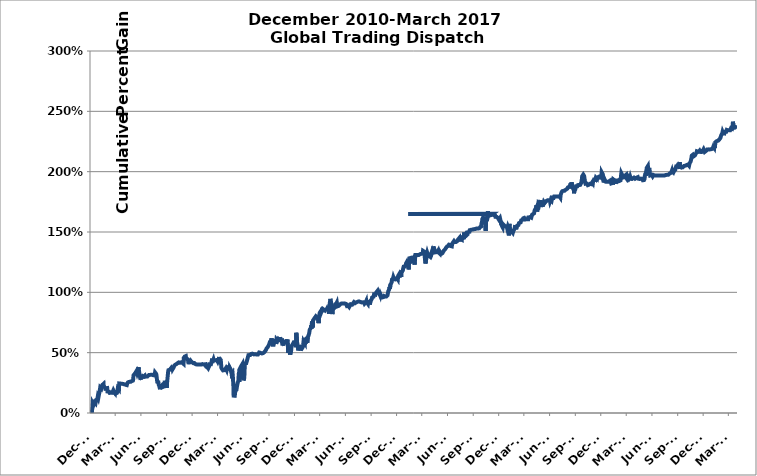
| Category | December 2010-December 2016 Global Trading Dispatch Performance |
|---|---|
| 2010-12-01 | 0 |
| 2010-12-02 | 0 |
| 2010-12-03 | 0 |
| 2010-12-07 | 0 |
| 2010-12-08 | 0 |
| 2010-12-09 | 0.048 |
| 2010-12-10 | 0.081 |
| 2010-12-13 | 0.067 |
| 2010-12-14 | 0.068 |
| 2010-12-15 | 0.075 |
| 2010-12-16 | 0.087 |
| 2010-12-17 | 0.087 |
| 2010-12-20 | 0.078 |
| 2010-12-22 | 0.107 |
| 2010-12-23 | 0.102 |
| 2010-12-24 | 0.102 |
| 2010-12-27 | 0.118 |
| 2010-12-28 | 0.132 |
| 2010-12-29 | 0.127 |
| 2010-12-30 | 0.122 |
| 2010-12-31 | 0.123 |
| 2011-01-03 | 0.17 |
| 2011-01-04 | 0.169 |
| 2011-01-05 | 0.195 |
| 2011-01-06 | 0.211 |
| 2011-01-07 | 0.211 |
| 2011-01-10 | 0.202 |
| 2011-01-11 | 0.211 |
| 2011-01-12 | 0.224 |
| 2011-01-13 | 0.22 |
| 2011-01-14 | 0.233 |
| 2011-01-18 | 0.242 |
| 2011-01-19 | 0.208 |
| 2011-01-20 | 0.217 |
| 2011-01-21 | 0.214 |
| 2011-01-24 | 0.208 |
| 2011-01-25 | 0.2 |
| 2011-01-26 | 0.187 |
| 2011-01-27 | 0.204 |
| 2011-01-28 | 0.21 |
| 2011-01-31 | 0.206 |
| 2011-02-01 | 0.178 |
| 2011-02-02 | 0.18 |
| 2011-02-03 | 0.184 |
| 2011-02-04 | 0.184 |
| 2011-02-07 | 0.176 |
| 2011-02-08 | 0.17 |
| 2011-02-09 | 0.167 |
| 2011-02-10 | 0.174 |
| 2011-02-11 | 0.172 |
| 2011-02-14 | 0.168 |
| 2011-02-15 | 0.17 |
| 2011-02-16 | 0.167 |
| 2011-02-17 | 0.164 |
| 2011-02-18 | 0.167 |
| 2011-02-22 | 0.189 |
| 2011-02-23 | 0.189 |
| 2011-02-24 | 0.179 |
| 2011-02-25 | 0.176 |
| 2011-02-28 | 0.166 |
| 2011-03-01 | 0.188 |
| 2011-03-02 | 0.181 |
| 2011-03-03 | 0.163 |
| 2011-03-04 | 0.167 |
| 2011-03-07 | 0.167 |
| 2011-03-08 | 0.175 |
| 2011-03-09 | 0.169 |
| 2011-03-10 | 0.205 |
| 2011-03-11 | 0.206 |
| 2011-03-14 | 0.194 |
| 2011-03-15 | 0.245 |
| 2011-03-16 | 0.25 |
| 2011-03-17 | 0.238 |
| 2011-03-18 | 0.238 |
| 2011-03-22 | 0.243 |
| 2011-03-23 | 0.245 |
| 2011-03-25 | 0.242 |
| 2011-03-28 | 0.241 |
| 2011-04-11 | 0.231 |
| 2011-04-12 | 0.241 |
| 2011-04-13 | 0.246 |
| 2011-04-14 | 0.246 |
| 2011-04-15 | 0.254 |
| 2011-04-18 | 0.254 |
| 2011-04-19 | 0.258 |
| 2011-04-20 | 0.256 |
| 2011-04-21 | 0.257 |
| 2011-04-25 | 0.259 |
| 2011-04-26 | 0.261 |
| 2011-04-29 | 0.265 |
| 2011-05-02 | 0.263 |
| 2011-05-03 | 0.268 |
| 2011-05-04 | 0.28 |
| 2011-05-05 | 0.312 |
| 2011-05-10 | 0.326 |
| 2011-05-11 | 0.334 |
| 2011-05-12 | 0.329 |
| 2011-05-13 | 0.337 |
| 2011-05-16 | 0.349 |
| 2011-05-17 | 0.344 |
| 2011-05-18 | 0.332 |
| 2011-05-19 | 0.33 |
| 2011-05-20 | 0.346 |
| 2011-05-23 | 0.38 |
| 2011-05-24 | 0.359 |
| 2011-05-25 | 0.344 |
| 2011-05-26 | 0.329 |
| 2011-05-27 | 0.308 |
| 2011-05-31 | 0.277 |
| 2011-06-01 | 0.312 |
| 2011-06-02 | 0.299 |
| 2011-06-03 | 0.304 |
| 2011-06-06 | 0.307 |
| 2011-06-07 | 0.3 |
| 2011-06-08 | 0.302 |
| 2011-06-09 | 0.304 |
| 2011-06-10 | 0.301 |
| 2011-06-13 | 0.303 |
| 2011-06-14 | 0.309 |
| 2011-06-15 | 0.3 |
| 2011-06-16 | 0.3 |
| 2011-06-17 | 0.301 |
| 2011-06-20 | 0.303 |
| 2011-06-21 | 0.305 |
| 2011-06-22 | 0.306 |
| 2011-06-23 | 0.302 |
| 2011-06-24 | 0.303 |
| 2011-06-27 | 0.31 |
| 2011-06-29 | 0.315 |
| 2011-06-30 | 0.316 |
| 2011-07-01 | 0.316 |
| 2011-07-05 | 0.316 |
| 2011-07-06 | 0.316 |
| 2011-07-08 | 0.317 |
| 2011-07-11 | 0.316 |
| 2011-07-12 | 0.313 |
| 2011-07-13 | 0.31 |
| 2011-07-14 | 0.313 |
| 2011-07-15 | 0.313 |
| 2011-07-18 | 0.313 |
| 2011-07-19 | 0.311 |
| 2011-07-20 | 0.311 |
| 2011-07-21 | 0.336 |
| 2011-07-22 | 0.33 |
| 2011-07-25 | 0.324 |
| 2011-07-26 | 0.315 |
| 2011-07-27 | 0.295 |
| 2011-07-28 | 0.275 |
| 2011-07-29 | 0.258 |
| 2011-08-01 | 0.257 |
| 2011-08-02 | 0.256 |
| 2011-08-03 | 0.236 |
| 2011-08-04 | 0.227 |
| 2011-08-05 | 0.224 |
| 2011-08-08 | 0.197 |
| 2011-08-09 | 0.195 |
| 2011-08-10 | 0.191 |
| 2011-08-11 | 0.222 |
| 2011-08-12 | 0.229 |
| 2011-08-15 | 0.232 |
| 2011-08-16 | 0.229 |
| 2011-08-17 | 0.229 |
| 2011-08-18 | 0.225 |
| 2011-08-19 | 0.217 |
| 2011-08-22 | 0.218 |
| 2011-08-23 | 0.221 |
| 2011-08-24 | 0.248 |
| 2011-08-25 | 0.267 |
| 2011-08-26 | 0.256 |
| 2011-08-29 | 0.262 |
| 2011-08-30 | 0.254 |
| 2011-08-31 | 0.226 |
| 2011-09-01 | 0.208 |
| 2011-09-02 | 0.251 |
| 2011-09-06 | 0.345 |
| 2011-09-07 | 0.355 |
| 2011-09-09 | 0.36 |
| 2011-09-12 | 0.359 |
| 2011-09-13 | 0.363 |
| 2011-09-14 | 0.364 |
| 2011-09-15 | 0.367 |
| 2011-09-16 | 0.371 |
| 2011-09-19 | 0.353 |
| 2011-09-20 | 0.388 |
| 2011-09-21 | 0.377 |
| 2011-09-22 | 0.364 |
| 2011-09-26 | 0.38 |
| 2011-09-27 | 0.39 |
| 2011-09-29 | 0.384 |
| 2011-09-30 | 0.398 |
| 2011-10-03 | 0.394 |
| 2011-10-05 | 0.405 |
| 2011-10-06 | 0.407 |
| 2011-10-10 | 0.413 |
| 2011-10-11 | 0.414 |
| 2011-10-12 | 0.418 |
| 2011-10-13 | 0.416 |
| 2011-10-14 | 0.42 |
| 2011-10-17 | 0.414 |
| 2011-10-18 | 0.416 |
| 2011-10-19 | 0.416 |
| 2011-10-21 | 0.422 |
| 2011-10-24 | 0.421 |
| 2011-10-25 | 0.413 |
| 2011-10-26 | 0.418 |
| 2011-10-31 | 0.407 |
| 2011-11-01 | 0.458 |
| 2011-11-02 | 0.46 |
| 2011-11-03 | 0.464 |
| 2011-11-04 | 0.468 |
| 2011-11-08 | 0.472 |
| 2011-11-09 | 0.452 |
| 2011-11-10 | 0.453 |
| 2011-11-11 | 0.457 |
| 2011-11-14 | 0.446 |
| 2011-11-15 | 0.447 |
| 2011-11-16 | 0.435 |
| 2011-11-17 | 0.419 |
| 2011-11-18 | 0.426 |
| 2011-11-21 | 0.419 |
| 2011-11-22 | 0.419 |
| 2011-11-23 | 0.426 |
| 2011-11-25 | 0.434 |
| 2011-11-28 | 0.426 |
| 2011-11-29 | 0.422 |
| 2011-11-30 | 0.423 |
| 2011-12-01 | 0.419 |
| 2011-12-05 | 0.413 |
| 2011-12-06 | 0.417 |
| 2011-12-07 | 0.414 |
| 2011-12-08 | 0.408 |
| 2011-12-09 | 0.414 |
| 2011-12-12 | 0.407 |
| 2011-12-13 | 0.404 |
| 2011-12-14 | 0.402 |
| 2011-12-15 | 0.402 |
| 2011-12-16 | 0.402 |
| 2011-12-19 | 0.402 |
| 2011-12-20 | 0.402 |
| 2011-12-21 | 0.402 |
| 2011-12-22 | 0.402 |
| 2011-12-23 | 0.402 |
| 2011-12-26 | 0.402 |
| 2011-12-27 | 0.402 |
| 2011-12-28 | 0.402 |
| 2011-12-29 | 0.402 |
| 2011-12-30 | 0.402 |
| 2012-01-02 | 0.402 |
| 2012-01-03 | 0.402 |
| 2012-01-04 | 0.402 |
| 2012-01-05 | 0.403 |
| 2012-01-06 | 0.405 |
| 2012-01-09 | 0.403 |
| 2012-01-10 | 0.402 |
| 2012-01-11 | 0.406 |
| 2012-01-12 | 0.4 |
| 2012-01-13 | 0.408 |
| 2012-01-17 | 0.404 |
| 2012-01-18 | 0.392 |
| 2012-01-19 | 0.384 |
| 2012-01-20 | 0.384 |
| 2012-01-23 | 0.379 |
| 2012-01-24 | 0.379 |
| 2012-01-25 | 0.372 |
| 2012-01-26 | 0.374 |
| 2012-01-27 | 0.37 |
| 2012-01-30 | 0.386 |
| 2012-01-31 | 0.405 |
| 2012-02-01 | 0.408 |
| 2012-02-02 | 0.402 |
| 2012-02-03 | 0.404 |
| 2012-02-06 | 0.405 |
| 2012-02-07 | 0.406 |
| 2012-02-08 | 0.41 |
| 2012-02-09 | 0.435 |
| 2012-02-10 | 0.432 |
| 2012-02-13 | 0.431 |
| 2012-02-14 | 0.432 |
| 2012-02-15 | 0.444 |
| 2012-02-16 | 0.435 |
| 2012-02-17 | 0.429 |
| 2012-02-21 | 0.436 |
| 2012-02-22 | 0.441 |
| 2012-02-23 | 0.438 |
| 2012-02-24 | 0.443 |
| 2012-02-27 | 0.44 |
| 2012-02-28 | 0.434 |
| 2012-02-29 | 0.432 |
| 2012-03-01 | 0.426 |
| 2012-03-02 | 0.427 |
| 2012-03-05 | 0.451 |
| 2012-03-06 | 0.464 |
| 2012-03-07 | 0.451 |
| 2012-03-08 | 0.453 |
| 2012-03-09 | 0.452 |
| 2012-03-12 | 0.439 |
| 2012-03-13 | 0.411 |
| 2012-03-14 | 0.375 |
| 2012-03-15 | 0.367 |
| 2012-03-16 | 0.366 |
| 2012-03-19 | 0.359 |
| 2012-03-20 | 0.353 |
| 2012-03-21 | 0.356 |
| 2012-03-22 | 0.359 |
| 2012-03-23 | 0.355 |
| 2012-03-26 | 0.356 |
| 2012-03-27 | 0.348 |
| 2012-03-28 | 0.35 |
| 2012-03-29 | 0.355 |
| 2012-03-30 | 0.37 |
| 2012-04-02 | 0.356 |
| 2012-04-03 | 0.368 |
| 2012-04-04 | 0.379 |
| 2012-04-05 | 0.375 |
| 2012-04-09 | 0.373 |
| 2012-04-10 | 0.391 |
| 2012-04-11 | 0.387 |
| 2012-04-12 | 0.353 |
| 2012-04-13 | 0.376 |
| 2012-04-16 | 0.363 |
| 2012-04-18 | 0.342 |
| 2012-04-19 | 0.352 |
| 2012-04-20 | 0.325 |
| 2012-04-23 | 0.335 |
| 2012-04-24 | 0.308 |
| 2012-04-25 | 0.269 |
| 2012-04-26 | 0.23 |
| 2012-04-27 | 0.144 |
| 2012-04-30 | 0.137 |
| 2012-05-01 | 0.143 |
| 2012-05-02 | 0.16 |
| 2012-05-03 | 0.183 |
| 2012-05-04 | 0.177 |
| 2012-05-07 | 0.192 |
| 2012-05-08 | 0.206 |
| 2012-05-09 | 0.222 |
| 2012-05-10 | 0.235 |
| 2012-05-11 | 0.244 |
| 2012-05-14 | 0.27 |
| 2012-05-15 | 0.31 |
| 2012-05-16 | 0.339 |
| 2012-05-17 | 0.26 |
| 2012-05-18 | 0.362 |
| 2012-05-21 | 0.367 |
| 2012-05-22 | 0.38 |
| 2012-05-23 | 0.374 |
| 2012-05-24 | 0.382 |
| 2012-05-25 | 0.381 |
| 2012-05-29 | 0.408 |
| 2012-05-30 | 0.386 |
| 2012-05-31 | 0.342 |
| 2012-06-01 | 0.27 |
| 2012-06-04 | 0.289 |
| 2012-06-05 | 0.344 |
| 2012-06-06 | 0.411 |
| 2012-06-07 | 0.415 |
| 2012-06-08 | 0.417 |
| 2012-06-11 | 0.413 |
| 2012-06-12 | 0.42 |
| 2012-06-13 | 0.429 |
| 2012-06-14 | 0.432 |
| 2012-06-15 | 0.445 |
| 2012-06-18 | 0.451 |
| 2012-06-19 | 0.48 |
| 2012-06-20 | 0.48 |
| 2012-06-21 | 0.48 |
| 2012-06-22 | 0.487 |
| 2012-06-25 | 0.48 |
| 2012-06-26 | 0.482 |
| 2012-06-27 | 0.484 |
| 2012-06-28 | 0.483 |
| 2012-06-29 | 0.489 |
| 2012-07-02 | 0.489 |
| 2012-07-03 | 0.492 |
| 2012-07-05 | 0.492 |
| 2012-07-06 | 0.489 |
| 2012-07-09 | 0.486 |
| 2012-07-10 | 0.484 |
| 2012-07-11 | 0.486 |
| 2012-07-12 | 0.481 |
| 2012-07-13 | 0.487 |
| 2012-07-16 | 0.485 |
| 2012-07-17 | 0.485 |
| 2012-07-18 | 0.485 |
| 2012-07-19 | 0.485 |
| 2012-07-20 | 0.485 |
| 2012-07-23 | 0.485 |
| 2012-07-24 | 0.485 |
| 2012-07-25 | 0.485 |
| 2012-07-26 | 0.489 |
| 2012-07-27 | 0.501 |
| 2012-07-30 | 0.494 |
| 2012-07-31 | 0.499 |
| 2012-08-02 | 0.506 |
| 2012-08-03 | 0.496 |
| 2012-08-06 | 0.493 |
| 2012-08-07 | 0.495 |
| 2012-08-08 | 0.495 |
| 2012-08-09 | 0.494 |
| 2012-08-10 | 0.496 |
| 2012-08-13 | 0.501 |
| 2012-08-14 | 0.503 |
| 2012-08-15 | 0.502 |
| 2012-08-16 | 0.501 |
| 2012-08-17 | 0.509 |
| 2012-08-20 | 0.52 |
| 2012-08-21 | 0.519 |
| 2012-08-22 | 0.518 |
| 2012-08-23 | 0.536 |
| 2012-08-24 | 0.541 |
| 2012-08-27 | 0.547 |
| 2012-08-28 | 0.545 |
| 2012-08-29 | 0.546 |
| 2012-08-30 | 0.542 |
| 2012-08-31 | 0.564 |
| 2012-09-04 | 0.59 |
| 2012-09-05 | 0.6 |
| 2012-09-06 | 0.6 |
| 2012-09-07 | 0.584 |
| 2012-09-10 | 0.618 |
| 2012-09-11 | 0.586 |
| 2012-09-12 | 0.582 |
| 2012-09-13 | 0.566 |
| 2012-09-16 | 0.565 |
| 2012-09-17 | 0.566 |
| 2012-09-18 | 0.566 |
| 2012-09-19 | 0.596 |
| 2012-09-20 | 0.593 |
| 2012-09-21 | 0.599 |
| 2012-09-24 | 0.599 |
| 2012-09-25 | 0.572 |
| 2012-09-26 | 0.566 |
| 2012-09-27 | 0.61 |
| 2012-10-01 | 0.599 |
| 2012-10-02 | 0.602 |
| 2012-10-03 | 0.605 |
| 2012-10-04 | 0.614 |
| 2012-10-05 | 0.614 |
| 2012-10-08 | 0.607 |
| 2012-10-09 | 0.601 |
| 2012-10-10 | 0.629 |
| 2012-10-11 | 0.614 |
| 2012-10-12 | 0.614 |
| 2012-10-15 | 0.599 |
| 2012-10-16 | 0.616 |
| 2012-10-17 | 0.603 |
| 2012-10-18 | 0.577 |
| 2012-10-19 | 0.559 |
| 2012-10-22 | 0.581 |
| 2012-10-23 | 0.586 |
| 2012-10-24 | 0.582 |
| 2012-10-25 | 0.591 |
| 2012-10-26 | 0.584 |
| 2012-10-30 | 0.584 |
| 2012-10-31 | 0.584 |
| 2012-11-01 | 0.605 |
| 2012-11-02 | 0.587 |
| 2012-11-05 | 0.609 |
| 2012-11-06 | 0.613 |
| 2012-11-07 | 0.551 |
| 2012-11-08 | 0.499 |
| 2012-11-09 | 0.521 |
| 2012-11-12 | 0.525 |
| 2012-11-13 | 0.514 |
| 2012-11-14 | 0.494 |
| 2012-11-15 | 0.484 |
| 2012-11-16 | 0.491 |
| 2012-11-19 | 0.524 |
| 2012-11-20 | 0.555 |
| 2012-11-21 | 0.554 |
| 2012-11-23 | 0.56 |
| 2012-11-26 | 0.576 |
| 2012-11-27 | 0.578 |
| 2012-11-28 | 0.587 |
| 2012-11-29 | 0.588 |
| 2012-11-30 | 0.582 |
| 2012-12-03 | 0.587 |
| 2012-12-04 | 0.586 |
| 2012-12-05 | 0.59 |
| 2012-12-06 | 0.546 |
| 2012-12-07 | 0.664 |
| 2012-12-10 | 0.583 |
| 2012-12-11 | 0.59 |
| 2012-12-12 | 0.578 |
| 2012-12-13 | 0.552 |
| 2012-12-14 | 0.518 |
| 2012-12-17 | 0.563 |
| 2012-12-18 | 0.558 |
| 2012-12-19 | 0.544 |
| 2012-12-20 | 0.537 |
| 2012-12-21 | 0.532 |
| 2012-12-24 | 0.534 |
| 2012-12-26 | 0.53 |
| 2012-12-27 | 0.532 |
| 2012-12-28 | 0.524 |
| 2012-12-31 | 0.55 |
| 2013-01-02 | 0.596 |
| 2013-01-03 | 0.591 |
| 2013-01-04 | 0.597 |
| 2013-01-07 | 0.578 |
| 2013-01-08 | 0.621 |
| 2013-01-09 | 0.574 |
| 2013-01-10 | 0.614 |
| 2013-01-11 | 0.619 |
| 2013-01-14 | 0.621 |
| 2013-01-15 | 0.582 |
| 2013-01-16 | 0.575 |
| 2013-01-17 | 0.623 |
| 2013-01-18 | 0.619 |
| 2013-01-22 | 0.66 |
| 2013-01-23 | 0.665 |
| 2013-01-24 | 0.69 |
| 2013-01-25 | 0.695 |
| 2013-01-28 | 0.705 |
| 2013-01-29 | 0.727 |
| 2013-01-30 | 0.699 |
| 2013-01-31 | 0.718 |
| 2013-02-01 | 0.76 |
| 2013-02-04 | 0.709 |
| 2013-02-05 | 0.768 |
| 2013-02-06 | 0.77 |
| 2013-02-07 | 0.773 |
| 2013-02-08 | 0.775 |
| 2013-02-11 | 0.788 |
| 2013-02-12 | 0.786 |
| 2013-02-13 | 0.796 |
| 2013-02-14 | 0.789 |
| 2013-02-15 | 0.802 |
| 2013-02-19 | 0.793 |
| 2013-02-20 | 0.804 |
| 2013-02-21 | 0.788 |
| 2013-02-22 | 0.801 |
| 2013-02-25 | 0.745 |
| 2013-02-26 | 0.792 |
| 2013-02-27 | 0.811 |
| 2013-02-28 | 0.819 |
| 2013-03-01 | 0.831 |
| 2013-03-04 | 0.842 |
| 2013-03-05 | 0.829 |
| 2013-03-06 | 0.836 |
| 2013-03-07 | 0.841 |
| 2013-03-08 | 0.854 |
| 2013-03-11 | 0.857 |
| 2013-03-12 | 0.852 |
| 2013-03-13 | 0.861 |
| 2013-03-14 | 0.868 |
| 2013-03-15 | 0.853 |
| 2013-03-18 | 0.852 |
| 2013-03-19 | 0.856 |
| 2013-03-20 | 0.869 |
| 2013-03-21 | 0.857 |
| 2013-03-22 | 0.852 |
| 2013-03-25 | 0.857 |
| 2013-03-26 | 0.862 |
| 2013-03-27 | 0.866 |
| 2013-03-28 | 0.862 |
| 2013-04-01 | 0.844 |
| 2013-04-02 | 0.839 |
| 2013-04-03 | 0.823 |
| 2013-04-04 | 0.86 |
| 2013-04-05 | 0.9 |
| 2013-04-08 | 0.946 |
| 2013-04-09 | 0.937 |
| 2013-04-10 | 0.92 |
| 2013-04-11 | 0.925 |
| 2013-04-12 | 0.889 |
| 2013-04-15 | 0.82 |
| 2013-04-16 | 0.884 |
| 2013-04-17 | 0.859 |
| 2013-04-18 | 0.856 |
| 2013-04-19 | 0.857 |
| 2013-04-22 | 0.87 |
| 2013-04-23 | 0.885 |
| 2013-04-24 | 0.888 |
| 2013-04-25 | 0.901 |
| 2013-04-26 | 0.904 |
| 2013-04-29 | 0.906 |
| 2013-04-30 | 0.911 |
| 2013-05-01 | 0.915 |
| 2013-05-02 | 0.909 |
| 2013-05-03 | 0.884 |
| 2013-05-06 | 0.886 |
| 2013-05-07 | 0.887 |
| 2013-05-08 | 0.884 |
| 2013-05-09 | 0.888 |
| 2013-05-10 | 0.894 |
| 2013-05-13 | 0.901 |
| 2013-05-14 | 0.902 |
| 2013-05-15 | 0.903 |
| 2013-05-16 | 0.903 |
| 2013-05-17 | 0.907 |
| 2013-05-20 | 0.908 |
| 2013-05-21 | 0.908 |
| 2013-05-22 | 0.907 |
| 2013-05-23 | 0.904 |
| 2013-05-24 | 0.904 |
| 2013-05-28 | 0.908 |
| 2013-05-29 | 0.909 |
| 2013-05-30 | 0.91 |
| 2013-05-31 | 0.908 |
| 2013-06-03 | 0.904 |
| 2013-06-04 | 0.909 |
| 2013-06-05 | 0.904 |
| 2013-06-06 | 0.887 |
| 2013-06-07 | 0.886 |
| 2013-06-10 | 0.889 |
| 2013-06-11 | 0.887 |
| 2013-06-12 | 0.891 |
| 2013-06-13 | 0.886 |
| 2013-06-14 | 0.878 |
| 2013-06-17 | 0.891 |
| 2013-06-18 | 0.9 |
| 2013-06-19 | 0.911 |
| 2013-06-20 | 0.888 |
| 2013-06-21 | 0.901 |
| 2013-06-24 | 0.895 |
| 2013-06-25 | 0.899 |
| 2013-06-26 | 0.903 |
| 2013-06-27 | 0.903 |
| 2013-06-28 | 0.904 |
| 2013-07-01 | 0.919 |
| 2013-07-02 | 0.913 |
| 2013-07-03 | 0.913 |
| 2013-07-05 | 0.91 |
| 2013-07-08 | 0.915 |
| 2013-07-09 | 0.916 |
| 2013-07-10 | 0.917 |
| 2013-07-11 | 0.921 |
| 2013-07-12 | 0.921 |
| 2013-07-15 | 0.923 |
| 2013-07-16 | 0.922 |
| 2013-07-17 | 0.92 |
| 2013-07-18 | 0.925 |
| 2013-07-19 | 0.925 |
| 2013-07-22 | 0.922 |
| 2013-07-23 | 0.921 |
| 2013-07-24 | 0.921 |
| 2013-07-25 | 0.914 |
| 2013-07-26 | 0.916 |
| 2013-07-29 | 0.916 |
| 2013-07-30 | 0.912 |
| 2013-07-31 | 0.914 |
| 2013-08-01 | 0.922 |
| 2013-08-02 | 0.917 |
| 2013-08-05 | 0.92 |
| 2013-08-06 | 0.918 |
| 2013-08-07 | 0.912 |
| 2013-08-08 | 0.907 |
| 2013-08-09 | 0.912 |
| 2013-08-12 | 0.917 |
| 2013-08-13 | 0.922 |
| 2013-08-14 | 0.928 |
| 2013-08-15 | 0.908 |
| 2013-08-16 | 0.917 |
| 2013-08-19 | 0.92 |
| 2013-08-20 | 0.904 |
| 2013-08-21 | 0.922 |
| 2013-08-22 | 0.927 |
| 2013-08-23 | 0.92 |
| 2013-08-26 | 0.922 |
| 2013-08-27 | 0.899 |
| 2013-08-28 | 0.906 |
| 2013-08-29 | 0.926 |
| 2013-08-30 | 0.932 |
| 2013-09-03 | 0.946 |
| 2013-09-04 | 0.957 |
| 2013-09-05 | 0.956 |
| 2013-09-06 | 0.95 |
| 2013-09-09 | 0.963 |
| 2013-09-10 | 0.971 |
| 2013-09-11 | 0.983 |
| 2013-09-12 | 0.981 |
| 2013-09-13 | 0.985 |
| 2013-09-16 | 0.98 |
| 2013-09-17 | 0.981 |
| 2013-09-18 | 0.986 |
| 2013-09-19 | 1 |
| 2013-09-20 | 0.997 |
| 2013-09-23 | 1.011 |
| 2013-09-24 | 0.999 |
| 2013-09-25 | 1 |
| 2013-09-26 | 1.002 |
| 2013-09-27 | 0.998 |
| 2013-09-30 | 0.989 |
| 2013-10-01 | 0.987 |
| 2013-10-02 | 0.984 |
| 2013-10-03 | 0.972 |
| 2013-10-04 | 0.984 |
| 2013-10-07 | 0.968 |
| 2013-10-08 | 0.968 |
| 2013-10-09 | 0.962 |
| 2013-10-10 | 0.961 |
| 2013-10-11 | 0.958 |
| 2013-10-14 | 0.959 |
| 2013-10-15 | 0.961 |
| 2013-10-16 | 0.962 |
| 2013-10-17 | 0.97 |
| 2013-10-18 | 0.966 |
| 2013-10-21 | 0.966 |
| 2013-10-22 | 0.966 |
| 2013-10-23 | 0.966 |
| 2013-10-24 | 0.966 |
| 2013-10-25 | 0.966 |
| 2013-10-28 | 0.973 |
| 2013-10-29 | 0.974 |
| 2013-10-30 | 0.987 |
| 2013-10-31 | 0.995 |
| 2013-11-01 | 1.011 |
| 2013-11-04 | 1.024 |
| 2013-11-05 | 1.044 |
| 2013-11-06 | 1.048 |
| 2013-11-07 | 1.028 |
| 2013-11-08 | 1.062 |
| 2013-11-11 | 1.073 |
| 2013-11-12 | 1.081 |
| 2013-11-13 | 1.084 |
| 2013-11-14 | 1.107 |
| 2013-11-15 | 1.114 |
| 2013-11-18 | 1.117 |
| 2013-11-19 | 1.126 |
| 2013-11-20 | 1.13 |
| 2013-11-21 | 1.12 |
| 2013-11-22 | 1.108 |
| 2013-11-25 | 1.117 |
| 2013-11-26 | 1.107 |
| 2013-11-27 | 1.111 |
| 2013-11-29 | 1.113 |
| 2013-12-02 | 1.119 |
| 2013-12-03 | 1.111 |
| 2013-12-04 | 1.116 |
| 2013-12-05 | 1.108 |
| 2013-12-06 | 1.136 |
| 2013-12-09 | 1.148 |
| 2013-12-10 | 1.146 |
| 2013-12-11 | 1.124 |
| 2013-12-12 | 1.136 |
| 2013-12-13 | 1.132 |
| 2013-12-16 | 1.143 |
| 2013-12-17 | 1.128 |
| 2013-12-18 | 1.181 |
| 2013-12-19 | 1.171 |
| 2013-12-20 | 1.166 |
| 2013-12-23 | 1.182 |
| 2013-12-24 | 1.198 |
| 2013-12-26 | 1.212 |
| 2013-12-27 | 1.216 |
| 2013-12-30 | 1.214 |
| 2013-12-31 | 1.225 |
| 2014-01-02 | 1.211 |
| 2014-01-03 | 1.238 |
| 2014-01-06 | 1.24 |
| 2014-01-07 | 1.255 |
| 2014-01-08 | 1.261 |
| 2014-01-09 | 1.253 |
| 2014-01-10 | 1.245 |
| 2014-01-13 | 1.19 |
| 2014-01-14 | 1.264 |
| 2014-01-15 | 1.282 |
| 2014-01-16 | 1.282 |
| 2014-01-17 | 1.282 |
| 2014-01-21 | 1.286 |
| 2014-01-22 | 1.289 |
| 2014-01-23 | 1.282 |
| 2014-01-24 | 1.267 |
| 2014-01-27 | 1.276 |
| 2014-01-28 | 1.268 |
| 2014-01-29 | 1.249 |
| 2014-01-30 | 1.264 |
| 2014-01-31 | 1.255 |
| 2014-02-03 | 1.23 |
| 2014-02-04 | 1.26 |
| 2014-02-05 | 1.288 |
| 2014-02-06 | 1.31 |
| 2014-02-07 | 1.31 |
| 2014-02-10 | 1.31 |
| 2014-02-11 | 1.31 |
| 2014-02-12 | 1.31 |
| 2014-02-13 | 1.31 |
| 2014-02-14 | 1.31 |
| 2014-02-18 | 1.31 |
| 2014-02-19 | 1.31 |
| 2014-02-20 | 1.31 |
| 2014-02-21 | 1.31 |
| 2014-02-24 | 1.318 |
| 2014-02-25 | 1.313 |
| 2014-02-26 | 1.318 |
| 2014-02-27 | 1.323 |
| 2014-02-28 | 1.32 |
| 2014-03-03 | 1.324 |
| 2014-03-04 | 1.326 |
| 2014-03-05 | 1.344 |
| 2014-03-06 | 1.349 |
| 2014-03-07 | 1.351 |
| 2014-03-10 | 1.337 |
| 2014-03-11 | 1.299 |
| 2014-03-12 | 1.294 |
| 2014-03-13 | 1.253 |
| 2014-03-14 | 1.239 |
| 2014-03-17 | 1.288 |
| 2014-03-18 | 1.311 |
| 2014-03-19 | 1.305 |
| 2014-03-20 | 1.33 |
| 2014-03-21 | 1.329 |
| 2014-03-24 | 1.301 |
| 2014-03-25 | 1.301 |
| 2014-03-26 | 1.303 |
| 2014-03-27 | 1.302 |
| 2014-03-28 | 1.301 |
| 2014-03-31 | 1.294 |
| 2014-04-01 | 1.293 |
| 2014-04-02 | 1.3 |
| 2014-04-03 | 1.303 |
| 2014-04-04 | 1.327 |
| 2014-04-07 | 1.347 |
| 2014-04-08 | 1.342 |
| 2014-04-09 | 1.335 |
| 2014-04-10 | 1.368 |
| 2014-04-11 | 1.38 |
| 2014-04-14 | 1.378 |
| 2014-04-15 | 1.351 |
| 2014-04-16 | 1.331 |
| 2014-04-17 | 1.333 |
| 2014-04-21 | 1.333 |
| 2014-04-22 | 1.333 |
| 2014-04-23 | 1.331 |
| 2014-04-24 | 1.34 |
| 2014-04-25 | 1.333 |
| 2014-04-28 | 1.345 |
| 2014-04-29 | 1.334 |
| 2014-04-30 | 1.334 |
| 2014-05-01 | 1.326 |
| 2014-05-02 | 1.33 |
| 2014-05-05 | 1.319 |
| 2014-05-06 | 1.33 |
| 2014-05-07 | 1.324 |
| 2014-05-08 | 1.324 |
| 2014-05-09 | 1.318 |
| 2014-05-12 | 1.324 |
| 2014-05-13 | 1.324 |
| 2014-05-14 | 1.324 |
| 2014-05-15 | 1.324 |
| 2014-05-16 | 1.324 |
| 2014-05-19 | 1.348 |
| 2014-05-20 | 1.346 |
| 2014-05-21 | 1.349 |
| 2014-05-22 | 1.354 |
| 2014-05-23 | 1.357 |
| 2014-05-27 | 1.371 |
| 2014-05-28 | 1.371 |
| 2014-05-29 | 1.378 |
| 2014-05-30 | 1.38 |
| 2014-06-02 | 1.378 |
| 2014-06-03 | 1.385 |
| 2014-06-04 | 1.383 |
| 2014-06-05 | 1.393 |
| 2014-06-06 | 1.395 |
| 2014-06-09 | 1.403 |
| 2014-06-10 | 1.394 |
| 2014-06-11 | 1.385 |
| 2014-06-12 | 1.379 |
| 2014-06-13 | 1.38 |
| 2014-06-16 | 1.381 |
| 2014-06-17 | 1.397 |
| 2014-06-18 | 1.4 |
| 2014-06-19 | 1.4 |
| 2014-06-20 | 1.413 |
| 2014-06-23 | 1.413 |
| 2014-06-24 | 1.426 |
| 2014-06-25 | 1.423 |
| 2014-06-26 | 1.42 |
| 2014-06-27 | 1.418 |
| 2014-06-30 | 1.422 |
| 2014-07-01 | 1.417 |
| 2014-07-02 | 1.418 |
| 2014-07-03 | 1.414 |
| 2014-07-07 | 1.428 |
| 2014-07-08 | 1.442 |
| 2014-07-09 | 1.432 |
| 2014-07-10 | 1.443 |
| 2014-07-11 | 1.446 |
| 2014-07-14 | 1.454 |
| 2014-07-15 | 1.451 |
| 2014-07-16 | 1.453 |
| 2014-07-17 | 1.422 |
| 2014-07-18 | 1.441 |
| 2014-07-21 | 1.442 |
| 2014-07-22 | 1.436 |
| 2014-07-23 | 1.464 |
| 2014-07-24 | 1.454 |
| 2014-07-25 | 1.444 |
| 2014-07-28 | 1.471 |
| 2014-07-29 | 1.441 |
| 2014-07-30 | 1.496 |
| 2014-07-31 | 1.496 |
| 2014-08-01 | 1.474 |
| 2014-08-04 | 1.483 |
| 2014-08-05 | 1.49 |
| 2014-08-06 | 1.487 |
| 2014-08-07 | 1.472 |
| 2014-08-08 | 1.466 |
| 2014-08-11 | 1.48 |
| 2014-08-12 | 1.511 |
| 2014-08-13 | 1.507 |
| 2014-08-14 | 1.501 |
| 2014-08-15 | 1.496 |
| 2014-08-18 | 1.502 |
| 2014-08-19 | 1.515 |
| 2014-08-20 | 1.513 |
| 2014-08-21 | 1.515 |
| 2014-08-22 | 1.516 |
| 2014-08-25 | 1.519 |
| 2014-08-26 | 1.523 |
| 2014-08-27 | 1.521 |
| 2014-08-28 | 1.52 |
| 2014-08-29 | 1.52 |
| 2014-09-02 | 1.523 |
| 2014-09-03 | 1.522 |
| 2014-09-04 | 1.524 |
| 2014-09-05 | 1.525 |
| 2014-09-08 | 1.525 |
| 2014-09-09 | 1.525 |
| 2014-09-10 | 1.526 |
| 2014-09-11 | 1.527 |
| 2014-09-12 | 1.529 |
| 2014-09-15 | 1.529 |
| 2014-09-16 | 1.529 |
| 2014-09-17 | 1.529 |
| 2014-09-18 | 1.529 |
| 2014-09-19 | 1.529 |
| 2014-09-22 | 1.53 |
| 2014-09-23 | 1.529 |
| 2014-09-24 | 1.535 |
| 2014-09-25 | 1.541 |
| 2014-09-26 | 1.536 |
| 2014-09-29 | 1.546 |
| 2014-09-30 | 1.57 |
| 2014-10-01 | 1.578 |
| 2014-10-02 | 1.585 |
| 2014-10-03 | 1.606 |
| 2014-10-06 | 1.622 |
| 2014-10-07 | 1.618 |
| 2014-10-08 | 1.616 |
| 2014-10-09 | 1.623 |
| 2014-10-10 | 1.606 |
| 2014-10-13 | 1.59 |
| 2014-10-14 | 1.574 |
| 2014-10-15 | 1.508 |
| 2014-10-16 | 1.562 |
| 2014-10-17 | 1.624 |
| 2014-10-20 | 1.59 |
| 2014-10-21 | 1.654 |
| 2014-10-22 | 1.645 |
| 2014-10-23 | 1.67 |
| 2014-10-24 | 1.631 |
| 2014-10-27 | 1.634 |
| 2014-10-28 | 1.637 |
| 2014-10-29 | 1.629 |
| 2014-10-30 | 1.635 |
| 2014-10-31 | 1.637 |
| 2014-11-03 | 1.64 |
| 2014-11-04 | 1.641 |
| 2014-11-05 | 1.641 |
| 2014-11-06 | 1.645 |
| 2014-11-07 | 1.644 |
| 2014-11-10 | 1.647 |
| 2014-11-11 | 1.651 |
| 2014-01-12 | 1.65 |
| 2014-11-13 | 1.649 |
| 2014-11-14 | 1.64 |
| 2014-11-17 | 1.645 |
| 2014-11-18 | 1.636 |
| 2014-11-19 | 1.626 |
| 2014-11-20 | 1.622 |
| 2014-11-21 | 1.625 |
| 2014-11-24 | 1.625 |
| 2014-11-25 | 1.623 |
| 2014-11-26 | 1.622 |
| 2014-11-28 | 1.616 |
| 2014-12-01 | 1.604 |
| 2014-12-02 | 1.608 |
| 2014-12-03 | 1.611 |
| 2014-12-04 | 1.596 |
| 2014-12-05 | 1.616 |
| 2014-12-08 | 1.586 |
| 2014-12-09 | 1.582 |
| 2014-12-10 | 1.559 |
| 2014-12-11 | 1.572 |
| 2014-12-12 | 1.552 |
| 2014-12-15 | 1.538 |
| 2014-12-16 | 1.553 |
| 2014-12-17 | 1.562 |
| 2014-12-18 | 1.557 |
| 2014-12-19 | 1.555 |
| 2014-12-22 | 1.55 |
| 2014-12-23 | 1.552 |
| 2014-12-24 | 1.549 |
| 2014-12-26 | 1.548 |
| 2014-12-29 | 1.547 |
| 2014-12-30 | 1.537 |
| 2014-12-31 | 1.528 |
| 2015-01-02 | 1.544 |
| 2015-01-05 | 1.524 |
| 2015-01-06 | 1.472 |
| 2015-01-07 | 1.509 |
| 2015-01-08 | 1.567 |
| 2015-01-09 | 1.529 |
| 2015-01-12 | 1.504 |
| 2015-01-13 | 1.514 |
| 2015-01-14 | 1.515 |
| 2015-01-15 | 1.488 |
| 2015-01-16 | 1.504 |
| 2015-01-20 | 1.492 |
| 2015-01-21 | 1.492 |
| 2015-01-22 | 1.508 |
| 2015-01-23 | 1.509 |
| 2015-01-26 | 1.526 |
| 2015-01-27 | 1.522 |
| 2015-01-28 | 1.523 |
| 2015-01-29 | 1.556 |
| 2015-01-30 | 1.535 |
| 2015-02-02 | 1.542 |
| 2015-02-03 | 1.535 |
| 2015-02-04 | 1.539 |
| 2015-02-05 | 1.553 |
| 2015-02-06 | 1.555 |
| 2015-02-09 | 1.557 |
| 2015-02-10 | 1.562 |
| 2015-02-11 | 1.573 |
| 2015-02-12 | 1.57 |
| 2015-02-13 | 1.576 |
| 2015-02-17 | 1.58 |
| 2015-02-18 | 1.585 |
| 2015-02-19 | 1.596 |
| 2015-02-20 | 1.597 |
| 2015-02-23 | 1.6 |
| 2015-02-24 | 1.603 |
| 2015-02-25 | 1.606 |
| 2015-02-26 | 1.613 |
| 2015-02-27 | 1.611 |
| 2015-03-02 | 1.617 |
| 2015-03-03 | 1.612 |
| 2015-03-04 | 1.615 |
| 2015-03-05 | 1.618 |
| 2015-03-06 | 1.604 |
| 2015-03-09 | 1.606 |
| 2015-03-10 | 1.606 |
| 2015-03-11 | 1.606 |
| 2015-03-12 | 1.606 |
| 2015-03-13 | 1.606 |
| 2015-03-16 | 1.606 |
| 2015-03-17 | 1.606 |
| 2015-03-18 | 1.635 |
| 2015-03-19 | 1.623 |
| 2015-03-20 | 1.624 |
| 2015-03-23 | 1.623 |
| 2015-03-24 | 1.623 |
| 2015-03-25 | 1.623 |
| 2015-03-26 | 1.618 |
| 2015-03-27 | 1.619 |
| 2015-03-30 | 1.643 |
| 2015-03-31 | 1.641 |
| 2015-04-01 | 1.64 |
| 2015-04-02 | 1.642 |
| 2015-04-06 | 1.655 |
| 2015-04-07 | 1.66 |
| 2015-04-08 | 1.678 |
| 2015-04-09 | 1.676 |
| 2015-04-10 | 1.684 |
| 2015-04-13 | 1.7 |
| 2015-04-14 | 1.688 |
| 2015-04-15 | 1.721 |
| 2015-04-16 | 1.728 |
| 2015-04-17 | 1.67 |
| 2015-04-20 | 1.713 |
| 2015-04-21 | 1.731 |
| 2015-04-22 | 1.734 |
| 2015-04-23 | 1.729 |
| 2015-04-24 | 1.721 |
| 2015-04-27 | 1.748 |
| 2015-04-28 | 1.745 |
| 2015-04-29 | 1.765 |
| 2015-04-30 | 1.707 |
| 2015-05-01 | 1.728 |
| 2015-05-04 | 1.73 |
| 2015-05-05 | 1.728 |
| 2015-05-06 | 1.712 |
| 2015-05-07 | 1.713 |
| 2015-05-08 | 1.713 |
| 2015-05-11 | 1.751 |
| 2015-05-12 | 1.756 |
| 2015-05-13 | 1.752 |
| 2015-05-14 | 1.741 |
| 2015-05-15 | 1.74 |
| 2015-05-18 | 1.752 |
| 2015-05-19 | 1.759 |
| 2015-05-20 | 1.757 |
| 2015-05-21 | 1.752 |
| 2015-05-22 | 1.76 |
| 2015-05-26 | 1.764 |
| 2015-05-27 | 1.763 |
| 2015-05-28 | 1.761 |
| 2015-05-29 | 1.758 |
| 2015-06-01 | 1.763 |
| 2015-06-02 | 1.752 |
| 2015-06-03 | 1.758 |
| 2015-06-04 | 1.747 |
| 2015-06-05 | 1.771 |
| 2015-06-08 | 1.762 |
| 2015-06-09 | 1.766 |
| 2015-06-10 | 1.785 |
| 2015-06-11 | 1.782 |
| 2015-06-12 | 1.782 |
| 2015-06-15 | 1.783 |
| 2015-06-16 | 1.786 |
| 2015-06-17 | 1.794 |
| 2015-06-18 | 1.794 |
| 2015-06-19 | 1.794 |
| 2015-06-22 | 1.795 |
| 2015-06-23 | 1.795 |
| 2015-06-24 | 1.795 |
| 2015-06-25 | 1.795 |
| 2015-06-26 | 1.795 |
| 2015-06-29 | 1.795 |
| 2015-06-30 | 1.795 |
| 2015-07-01 | 1.795 |
| 2015-07-02 | 1.795 |
| 2015-07-06 | 1.795 |
| 2015-07-07 | 1.795 |
| 2015-07-08 | 1.795 |
| 2015-07-09 | 1.785 |
| 2015-07-10 | 1.807 |
| 2015-07-13 | 1.828 |
| 2015-07-14 | 1.83 |
| 2015-07-15 | 1.833 |
| 2015-07-16 | 1.838 |
| 2015-07-17 | 1.843 |
| 2015-07-20 | 1.841 |
| 2015-07-21 | 1.836 |
| 2015-07-22 | 1.844 |
| 2015-07-23 | 1.842 |
| 2015-07-24 | 1.842 |
| 2015-07-27 | 1.846 |
| 2015-07-28 | 1.85 |
| 2015-07-29 | 1.846 |
| 2015-07-30 | 1.847 |
| 2015-07-31 | 1.85 |
| 2015-08-03 | 1.859 |
| 2015-08-04 | 1.861 |
| 2015-08-05 | 1.87 |
| 2015-08-06 | 1.872 |
| 2015-08-07 | 1.869 |
| 2015-08-10 | 1.875 |
| 2015-08-11 | 1.862 |
| 2015-08-12 | 1.871 |
| 2015-08-13 | 1.892 |
| 2015-08-14 | 1.895 |
| 2015-08-17 | 1.9 |
| 2015-08-18 | 1.912 |
| 2015-08-19 | 1.908 |
| 2015-08-20 | 1.905 |
| 2015-08-21 | 1.88 |
| 2015-08-24 | 1.855 |
| 2015-08-25 | 1.865 |
| 2015-08-26 | 1.853 |
| 2015-08-27 | 1.82 |
| 2015-08-28 | 1.84 |
| 2015-08-31 | 1.85 |
| 2015-09-01 | 1.845 |
| 2015-09-02 | 1.868 |
| 2015-09-03 | 1.879 |
| 2015-09-04 | 1.879 |
| 2015-09-08 | 1.88 |
| 2015-09-09 | 1.883 |
| 2015-09-10 | 1.889 |
| 2015-09-11 | 1.89 |
| 2015-09-14 | 1.89 |
| 2015-09-15 | 1.89 |
| 2015-09-16 | 1.89 |
| 2015-09-17 | 1.89 |
| 2015-09-18 | 1.89 |
| 2015-09-21 | 1.891 |
| 2015-09-22 | 1.909 |
| 2015-09-23 | 1.91 |
| 2015-09-24 | 1.94 |
| 2015-09-25 | 1.962 |
| 2015-09-28 | 1.963 |
| 2015-09-29 | 1.976 |
| 2015-09-30 | 1.97 |
| 2015-10-01 | 1.968 |
| 2015-10-02 | 1.965 |
| 2015-10-05 | 1.918 |
| 2015-10-06 | 1.908 |
| 2015-10-07 | 1.899 |
| 2015-10-08 | 1.902 |
| 2015-10-09 | 1.901 |
| 2015-10-12 | 1.9 |
| 2015-10-13 | 1.905 |
| 2015-10-14 | 1.903 |
| 2015-10-15 | 1.888 |
| 2015-10-16 | 1.886 |
| 2015-10-19 | 1.892 |
| 2015-10-20 | 1.899 |
| 2015-10-21 | 1.896 |
| 2015-10-22 | 1.898 |
| 2015-10-23 | 1.899 |
| 2015-10-26 | 1.896 |
| 2015-10-27 | 1.897 |
| 2015-10-28 | 1.896 |
| 2015-10-29 | 1.901 |
| 2015-10-30 | 1.908 |
| 2015-11-02 | 1.9 |
| 2015-11-03 | 1.916 |
| 2015-11-04 | 1.917 |
| 2015-11-05 | 1.919 |
| 2015-11-06 | 1.933 |
| 2015-11-09 | 1.938 |
| 2015-11-10 | 1.932 |
| 2015-11-11 | 1.939 |
| 2015-11-12 | 1.943 |
| 2015-11-13 | 1.951 |
| 2015-11-16 | 1.95 |
| 2015-11-17 | 1.943 |
| 2015-11-18 | 1.961 |
| 2015-11-19 | 1.945 |
| 2015-11-20 | 1.952 |
| 2015-11-23 | 1.958 |
| 2015-11-24 | 1.953 |
| 2015-11-25 | 1.957 |
| 2015-11-27 | 1.961 |
| 2015-11-30 | 1.966 |
| 2015-12-01 | 1.959 |
| 2015-12-02 | 1.958 |
| 2015-12-03 | 1.937 |
| 2015-12-04 | 1.994 |
| 2015-12-07 | 1.991 |
| 2015-12-08 | 1.977 |
| 2015-12-09 | 1.929 |
| 2015-12-10 | 1.946 |
| 2015-12-11 | 1.91 |
| 2015-12-14 | 1.916 |
| 2015-12-15 | 1.932 |
| 2015-12-16 | 1.939 |
| 2015-12-17 | 1.93 |
| 2015-12-18 | 1.917 |
| 2015-12-21 | 1.917 |
| 2015-12-22 | 1.917 |
| 2015-12-23 | 1.917 |
| 2015-12-24 | 1.917 |
| 2015-12-28 | 1.917 |
| 2015-12-29 | 1.917 |
| 2015-12-30 | 1.917 |
| 2015-12-31 | 1.917 |
| 2016-01-04 | 1.928 |
| 2016-01-05 | 1.934 |
| 2016-01-06 | 1.935 |
| 2016-01-07 | 1.902 |
| 2016-01-08 | 1.899 |
| 2016-01-11 | 1.906 |
| 2016-01-12 | 1.894 |
| 2016-01-13 | 1.893 |
| 2016-01-14 | 1.911 |
| 2016-01-15 | 1.934 |
| 2016-01-19 | 1.927 |
| 2016-01-20 | 1.917 |
| 2016-01-21 | 1.928 |
| 2016-01-22 | 1.899 |
| 2016-01-25 | 1.937 |
| 2016-01-26 | 1.907 |
| 2016-01-27 | 1.94 |
| 2016-01-28 | 1.938 |
| 2016-01-29 | 1.929 |
| 2016-02-01 | 1.92 |
| 2016-02-02 | 1.912 |
| 2016-02-03 | 1.919 |
| 2016-02-04 | 1.925 |
| 2016-02-05 | 1.923 |
| 2016-02-08 | 1.926 |
| 2016-02-09 | 1.927 |
| 2016-02-10 | 1.933 |
| 2016-02-11 | 1.92 |
| 2016-02-12 | 1.987 |
| 2016-02-16 | 1.969 |
| 2016-02-17 | 1.948 |
| 2016-02-18 | 1.957 |
| 2016-02-19 | 1.969 |
| 2016-02-22 | 1.938 |
| 2016-02-23 | 1.955 |
| 2016-02-24 | 1.964 |
| 2016-02-25 | 1.969 |
| 2016-02-26 | 1.968 |
| 2016-02-29 | 1.974 |
| 2016-03-01 | 1.948 |
| 2016-03-02 | 1.955 |
| 2016-03-03 | 1.946 |
| 2016-03-04 | 1.937 |
| 2016-03-07 | 1.94 |
| 2016-03-08 | 1.953 |
| 2016-03-09 | 1.947 |
| 2016-03-10 | 1.958 |
| 2016-03-11 | 1.939 |
| 2016-03-14 | 1.947 |
| 2016-03-15 | 1.956 |
| 2016-03-16 | 1.955 |
| 2016-03-17 | 1.942 |
| 2016-03-18 | 1.935 |
| 2016-03-21 | 1.939 |
| 2016-03-22 | 1.941 |
| 2016-03-23 | 1.947 |
| 2016-03-24 | 1.947 |
| 2016-03-28 | 1.95 |
| 2016-03-29 | 1.95 |
| 2016-03-30 | 1.944 |
| 2016-03-31 | 1.95 |
| 2016-04-01 | 1.942 |
| 2016-04-04 | 1.946 |
| 2016-04-05 | 1.949 |
| 2016-04-06 | 1.951 |
| 2016-04-07 | 1.952 |
| 2016-04-08 | 1.952 |
| 2016-04-11 | 1.955 |
| 2016-04-12 | 1.95 |
| 2016-04-13 | 1.942 |
| 2016-04-14 | 1.942 |
| 2016-04-15 | 1.945 |
| 2016-04-18 | 1.939 |
| 2016-04-19 | 1.934 |
| 2016-04-20 | 1.932 |
| 2016-04-21 | 1.942 |
| 2016-04-22 | 1.942 |
| 2016-04-25 | 1.944 |
| 2016-04-26 | 1.941 |
| 2016-04-27 | 1.943 |
| 2016-04-28 | 1.94 |
| 2016-04-29 | 1.929 |
| 2016-05-02 | 1.928 |
| 2016-05-03 | 1.93 |
| 2016-05-04 | 1.936 |
| 2016-05-05 | 1.94 |
| 2016-05-06 | 1.964 |
| 2016-05-09 | 1.989 |
| 2016-05-10 | 1.968 |
| 2016-05-11 | 2.003 |
| 2016-05-12 | 2.009 |
| 2016-05-13 | 2.032 |
| 2016-05-16 | 2.029 |
| 2016-05-17 | 2.047 |
| 2016-05-18 | 2.021 |
| 2016-05-19 | 2.017 |
| 2016-05-20 | 2.015 |
| 2016-05-23 | 2.018 |
| 2016-05-24 | 1.98 |
| 2016-05-25 | 1.968 |
| 2016-05-26 | 1.97 |
| 2016-05-27 | 1.967 |
| 2016-05-31 | 1.973 |
| 2016-06-01 | 1.966 |
| 2016-06-02 | 1.978 |
| 2016-06-03 | 1.961 |
| 2016-06-06 | 1.972 |
| 2016-06-07 | 1.97 |
| 2016-06-08 | 1.97 |
| 2016-06-09 | 1.968 |
| 2016-06-10 | 1.968 |
| 2016-06-13 | 1.968 |
| 2016-06-14 | 1.968 |
| 2016-06-15 | 1.968 |
| 2016-06-16 | 1.968 |
| 2016-06-17 | 1.968 |
| 2016-06-20 | 1.968 |
| 2016-06-21 | 1.968 |
| 2016-06-22 | 1.968 |
| 2016-06-23 | 1.968 |
| 2016-06-24 | 1.968 |
| 2016-06-27 | 1.968 |
| 2016-06-28 | 1.968 |
| 2016-06-29 | 1.968 |
| 2016-06-30 | 1.968 |
| 2016-07-01 | 1.968 |
| 2016-07-05 | 1.968 |
| 2016-07-06 | 1.968 |
| 2016-07-07 | 1.968 |
| 2016-07-08 | 1.968 |
| 2016-07-11 | 1.968 |
| 2016-07-12 | 1.968 |
| 2016-07-13 | 1.968 |
| 2016-07-14 | 1.968 |
| 2016-07-15 | 1.968 |
| 2016-07-18 | 1.969 |
| 2016-07-19 | 1.972 |
| 2016-07-20 | 1.967 |
| 2016-07-21 | 1.971 |
| 2016-07-22 | 1.969 |
| 2016-07-25 | 1.974 |
| 2016-07-26 | 1.974 |
| 2016-07-27 | 1.974 |
| 2016-07-28 | 1.974 |
| 2016-07-29 | 1.974 |
| 2016-08-01 | 1.978 |
| 2016-08-02 | 1.983 |
| 2016-08-03 | 1.983 |
| 2016-08-04 | 1.985 |
| 2016-08-05 | 1.988 |
| 2016-08-08 | 1.991 |
| 2016-08-09 | 1.992 |
| 2016-08-10 | 1.987 |
| 2016-08-11 | 2.01 |
| 2016-08-12 | 2 |
| 2016-08-15 | 2.004 |
| 2016-08-16 | 1.992 |
| 2016-08-17 | 1.995 |
| 2016-08-18 | 1.998 |
| 2016-08-19 | 2.007 |
| 2016-08-22 | 2.006 |
| 2016-08-23 | 2.017 |
| 2016-08-24 | 2.028 |
| 2016-08-25 | 2.031 |
| 2016-08-26 | 2.043 |
| 2016-08-29 | 2.042 |
| 2016-08-30 | 2.041 |
| 2016-08-31 | 2.05 |
| 2016-09-01 | 2.051 |
| 2016-09-02 | 2.061 |
| 2016-09-06 | 2.066 |
| 2016-09-07 | 2.074 |
| 2016-09-08 | 2.079 |
| 2016-09-09 | 2.022 |
| 2016-09-12 | 2.047 |
| 2016-09-13 | 2.025 |
| 2016-09-14 | 2.031 |
| 2016-09-15 | 2.037 |
| 2016-09-16 | 2.037 |
| 2016-09-19 | 2.037 |
| 2016-09-20 | 2.037 |
| 2016-09-21 | 2.037 |
| 2016-09-22 | 2.036 |
| 2016-09-23 | 2.048 |
| 2016-09-26 | 2.052 |
| 2016-09-27 | 2.049 |
| 2016-09-28 | 2.05 |
| 2016-09-29 | 2.046 |
| 2016-09-30 | 2.052 |
| 2016-10-03 | 2.055 |
| 2016-10-04 | 2.057 |
| 2016-10-05 | 2.063 |
| 2016-10-06 | 2.061 |
| 2016-10-07 | 2.059 |
| 2016-10-10 | 2.061 |
| 2016-10-11 | 2.049 |
| 2016-10-12 | 2.05 |
| 2016-10-13 | 2.068 |
| 2016-10-14 | 2.07 |
| 2016-10-17 | 2.086 |
| 2016-10-18 | 2.097 |
| 2016-10-19 | 2.106 |
| 2016-10-20 | 2.121 |
| 2016-10-21 | 2.134 |
| 2016-10-24 | 2.134 |
| 2016-10-25 | 2.141 |
| 2016-10-26 | 2.142 |
| 2016-10-27 | 2.135 |
| 2016-10-28 | 2.128 |
| 2016-10-31 | 2.133 |
| 2016-11-01 | 2.135 |
| 2016-11-02 | 2.135 |
| 2016-11-03 | 2.135 |
| 2016-11-04 | 2.135 |
| 2016-11-07 | 2.16 |
| 2016-11-08 | 2.169 |
| 2016-11-09 | 2.163 |
| 2016-11-10 | 2.163 |
| 2016-11-11 | 2.163 |
| 2016-11-14 | 2.165 |
| 2016-11-15 | 2.165 |
| 2016-11-16 | 2.16 |
| 2016-11-17 | 2.169 |
| 2016-11-18 | 2.175 |
| 2016-11-21 | 2.164 |
| 2016-11-22 | 2.166 |
| 2016-11-23 | 2.17 |
| 2016-11-24 | 2.17 |
| 2016-11-25 | 2.163 |
| 2016-11-28 | 2.17 |
| 2016-11-29 | 2.169 |
| 2016-11-30 | 2.177 |
| 2016-12-01 | 2.183 |
| 2016-12-02 | 2.186 |
| 2016-12-05 | 2.191 |
| 2016-12-06 | 2.164 |
| 2016-12-07 | 2.158 |
| 2016-12-08 | 2.163 |
| 2016-12-09 | 2.168 |
| 2016-12-12 | 2.174 |
| 2016-12-13 | 2.176 |
| 2016-12-14 | 2.179 |
| 2016-12-15 | 2.184 |
| 2016-12-16 | 2.186 |
| 2016-12-19 | 2.185 |
| 2016-12-20 | 2.185 |
| 2016-12-21 | 2.182 |
| 2016-12-22 | 2.184 |
| 2016-12-23 | 2.184 |
| 2016-12-27 | 2.186 |
| 2016-12-28 | 2.186 |
| 2016-12-29 | 2.186 |
| 2016-12-30 | 2.186 |
| 2017-01-03 | 2.19 |
| 2017-01-04 | 2.194 |
| 2017-01-05 | 2.184 |
| 2017-01-06 | 2.208 |
| 2017-01-09 | 2.198 |
| 2017-01-10 | 2.222 |
| 2017-01-11 | 2.198 |
| 2017-01-12 | 2.211 |
| 2017-01-13 | 2.243 |
| 2017-01-18 | 2.253 |
| 2017-01-19 | 2.257 |
| 2017-01-20 | 2.259 |
| 2017-01-23 | 2.257 |
| 2017-01-24 | 2.257 |
| 2017-01-25 | 2.264 |
| 2017-01-26 | 2.263 |
| 2017-01-27 | 2.266 |
| 2017-01-30 | 2.273 |
| 2017-01-31 | 2.279 |
| 2017-02-01 | 2.281 |
| 2017-02-02 | 2.284 |
| 2017-02-03 | 2.302 |
| 2017-02-06 | 2.303 |
| 2017-02-07 | 2.319 |
| 2017-02-08 | 2.33 |
| 2017-02-10 | 2.325 |
| 2017-02-13 | 2.302 |
| 2017-02-14 | 2.321 |
| 2017-02-15 | 2.315 |
| 2017-02-16 | 2.325 |
| 2017-02-17 | 2.332 |
| 2017-02-21 | 2.332 |
| 2017-02-22 | 2.336 |
| 2017-02-23 | 2.346 |
| 2017-02-24 | 2.343 |
| 2017-02-27 | 2.343 |
| 2017-02-28 | 2.343 |
| 2017-03-01 | 2.343 |
| 2017-03-02 | 2.343 |
| 2017-03-03 | 2.343 |
| 2017-03-06 | 2.343 |
| 2017-03-07 | 2.343 |
| 2017-03-08 | 2.343 |
| 2017-03-09 | 2.343 |
| 2017-03-10 | 2.36 |
| 2017-03-13 | 2.36 |
| 2017-03-14 | 2.356 |
| 2017-03-15 | 2.365 |
| 2017-03-16 | 2.386 |
| 2017-03-17 | 2.414 |
| 2017-03-20 | 2.363 |
| 2017-03-21 | 2.36 |
| 2017-03-22 | 2.364 |
| 2017-03-23 | 2.364 |
| 2017-03-24 | 2.365 |
| 2017-03-27 | 2.36 |
| 2017-03-28 | 2.374 |
| 2017-03-29 | 2.385 |
| 2017-03-30 | 2.38 |
| 2017-03-31 | 2.392 |